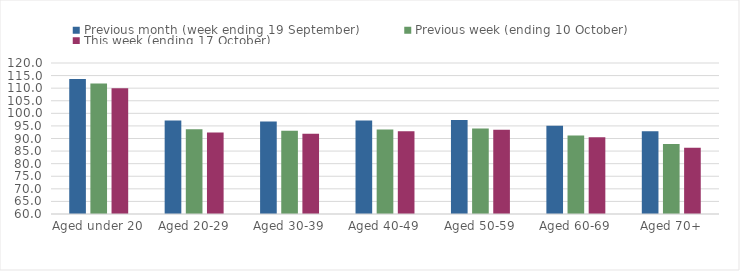
| Category | Previous month (week ending 19 September) | Previous week (ending 10 October) | This week (ending 17 October) |
|---|---|---|---|
| Aged under 20 | 113.64 | 111.88 | 109.94 |
| Aged 20-29 | 97.18 | 93.71 | 92.36 |
| Aged 30-39 | 96.72 | 93.05 | 91.85 |
| Aged 40-49 | 97.11 | 93.54 | 92.86 |
| Aged 50-59 | 97.34 | 93.98 | 93.47 |
| Aged 60-69 | 95.08 | 91.18 | 90.45 |
| Aged 70+ | 92.93 | 87.79 | 86.33 |